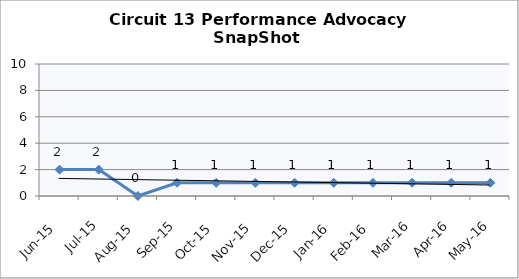
| Category | Circuit 13 |
|---|---|
| Jun-15 | 2 |
| Jul-15 | 2 |
| Aug-15 | 0 |
| Sep-15 | 1 |
| Oct-15 | 1 |
| Nov-15 | 1 |
| Dec-15 | 1 |
| Jan-16 | 1 |
| Feb-16 | 1 |
| Mar-16 | 1 |
| Apr-16 | 1 |
| May-16 | 1 |